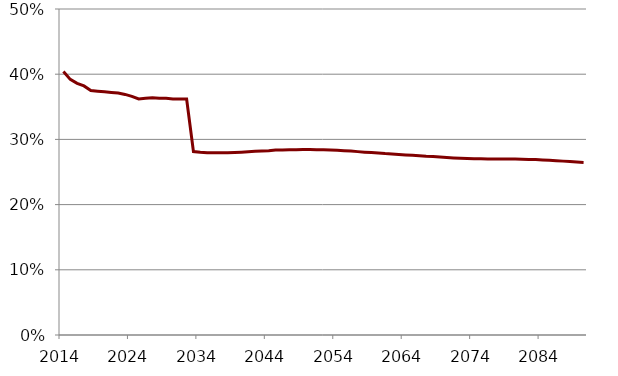
| Category | Series 1 |
|---|---|
| 2014.0 | 0.404 |
| 2015.0 | 0.392 |
| 2016.0 | 0.386 |
| 2017.0 | 0.382 |
| 2018.0 | 0.375 |
| 2019.0 | 0.374 |
| 2020.0 | 0.373 |
| 2021.0 | 0.372 |
| 2022.0 | 0.371 |
| 2023.0 | 0.369 |
| 2024.0 | 0.366 |
| 2025.0 | 0.362 |
| 2026.0 | 0.363 |
| 2027.0 | 0.364 |
| 2028.0 | 0.363 |
| 2029.0 | 0.363 |
| 2030.0 | 0.362 |
| 2031.0 | 0.362 |
| 2032.0 | 0.362 |
| 2033.0 | 0.281 |
| 2034.0 | 0.28 |
| 2035.0 | 0.279 |
| 2036.0 | 0.28 |
| 2037.0 | 0.279 |
| 2038.0 | 0.28 |
| 2039.0 | 0.28 |
| 2040.0 | 0.28 |
| 2041.0 | 0.281 |
| 2042.0 | 0.282 |
| 2043.0 | 0.282 |
| 2044.0 | 0.283 |
| 2045.0 | 0.284 |
| 2046.0 | 0.284 |
| 2047.0 | 0.284 |
| 2048.0 | 0.284 |
| 2049.0 | 0.284 |
| 2050.0 | 0.284 |
| 2051.0 | 0.284 |
| 2052.0 | 0.284 |
| 2053.0 | 0.284 |
| 2054.0 | 0.283 |
| 2055.0 | 0.283 |
| 2056.0 | 0.282 |
| 2057.0 | 0.281 |
| 2058.0 | 0.28 |
| 2059.0 | 0.28 |
| 2060.0 | 0.279 |
| 2061.0 | 0.278 |
| 2062.0 | 0.278 |
| 2063.0 | 0.277 |
| 2064.0 | 0.276 |
| 2065.0 | 0.276 |
| 2066.0 | 0.275 |
| 2067.0 | 0.274 |
| 2068.0 | 0.274 |
| 2069.0 | 0.273 |
| 2070.0 | 0.272 |
| 2071.0 | 0.271 |
| 2072.0 | 0.271 |
| 2073.0 | 0.271 |
| 2074.0 | 0.27 |
| 2075.0 | 0.27 |
| 2076.0 | 0.27 |
| 2077.0 | 0.27 |
| 2078.0 | 0.27 |
| 2079.0 | 0.27 |
| 2080.0 | 0.27 |
| 2081.0 | 0.27 |
| 2082.0 | 0.269 |
| 2083.0 | 0.269 |
| 2084.0 | 0.269 |
| 2085.0 | 0.268 |
| 2086.0 | 0.267 |
| 2087.0 | 0.267 |
| 2088.0 | 0.266 |
| 2089.0 | 0.265 |
| 2090.0 | 0.265 |